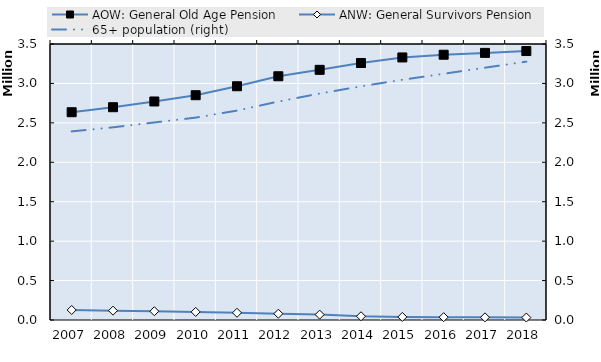
| Category | AOW: General Old Age Pension | ANW: General Survivors Pension | Series 14 |
|---|---|---|---|
| 2007.0 | 2634740 | 127000 |  |
| 2008.0 | 2698490 | 118610 |  |
| 2009.0 | 2771100 | 111100 |  |
| 2010.0 | 2850500 | 102500 |  |
| 2011.0 | 2964320 | 91490 |  |
| 2012.0 | 3091007.5 | 79625 |  |
| 2013.0 | 3172450.833 | 68500 |  |
| 2014.0 | 3258963.333 | 47210 |  |
| 2015.0 | 3329431.333 | 38860 |  |
| 2016.0 | 3364059.833 | 35910 |  |
| 2017.0 | 3387352.333 | 33490 |  |
| 2018.0 | 3410668.333 | 31110 |  |